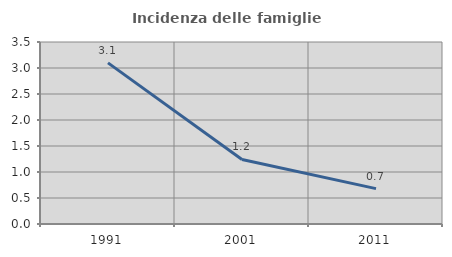
| Category | Incidenza delle famiglie numerose |
|---|---|
| 1991.0 | 3.099 |
| 2001.0 | 1.242 |
| 2011.0 | 0.68 |